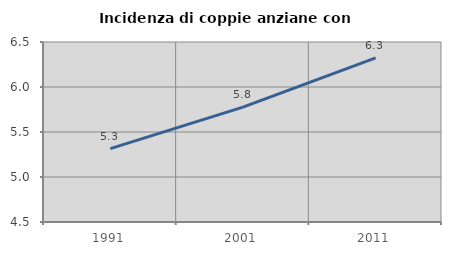
| Category | Incidenza di coppie anziane con figli |
|---|---|
| 1991.0 | 5.316 |
| 2001.0 | 5.776 |
| 2011.0 | 6.324 |